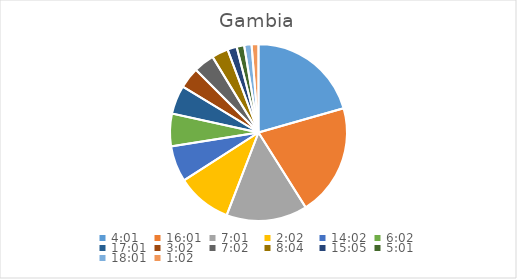
| Category | Series 0 |
|---|---|
| 0.1673611111111111 | 23.14 |
| 0.6673611111111111 | 23.028 |
| 0.2923611111111111 | 16.645 |
| 0.08472222222222221 | 11.327 |
| 0.5847222222222223 | 7.383 |
| 0.2513888888888889 | 6.682 |
| 0.7090277777777777 | 5.887 |
| 0.12638888888888888 | 4.331 |
| 0.29305555555555557 | 4.271 |
| 0.3361111111111111 | 3.391 |
| 0.6284722222222222 | 1.907 |
| 0.20902777777777778 | 1.543 |
| 0.7506944444444444 | 1.524 |
| 0.04305555555555556 | 1.41 |